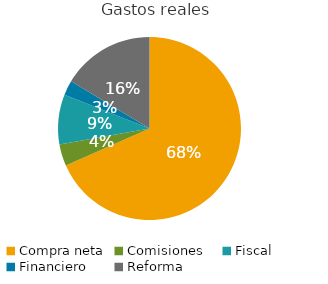
| Category | Real |
|---|---|
| Compra neta | 120000 |
| Comisiones | 6700 |
| Fiscal  | 15525 |
| Financiero | 4537.5 |
| Reforma | 28761 |